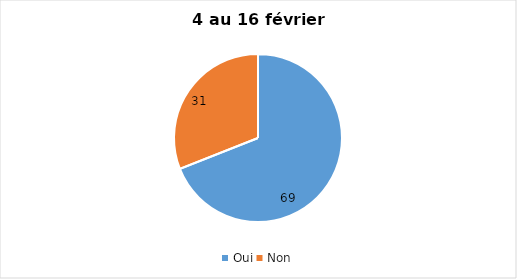
| Category | 4 au 16 février 2022 |
|---|---|
| Oui | 69 |
| Non | 31 |